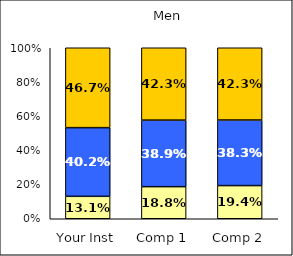
| Category | Low Negative Cross-Racial Interaction | Average Negative Cross-Racial Interaction | High Negative Cross-Racial Interaction |
|---|---|---|---|
| Your Inst | 0.131 | 0.402 | 0.467 |
| Comp 1 | 0.188 | 0.389 | 0.423 |
| Comp 2 | 0.194 | 0.383 | 0.423 |